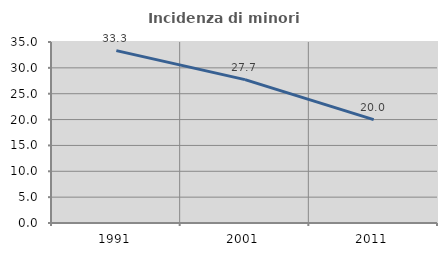
| Category | Incidenza di minori stranieri |
|---|---|
| 1991.0 | 33.333 |
| 2001.0 | 27.731 |
| 2011.0 | 20 |